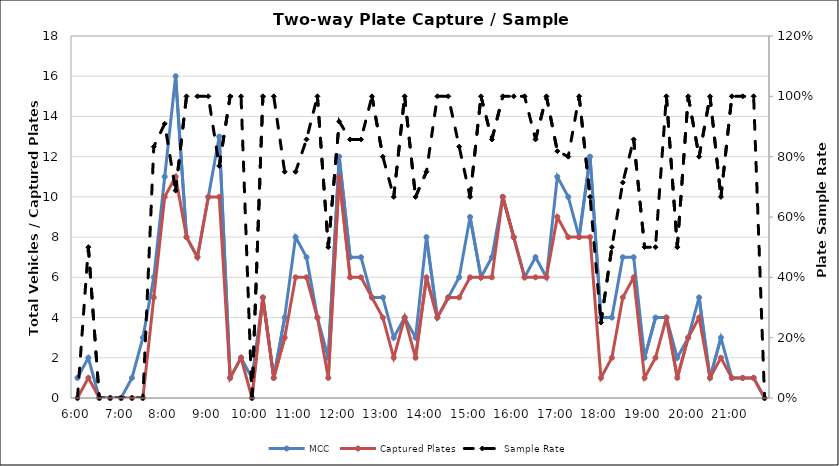
| Category | MCC | Captured Plates |
|---|---|---|
| 0.25 | 1 | 0 |
| 0.260416666666667 | 2 | 1 |
| 0.270833333333333 | 0 | 0 |
| 0.28125 | 0 | 0 |
| 0.291666666666667 | 0 | 0 |
| 0.302083333333333 | 1 | 0 |
| 0.3125 | 3 | 0 |
| 0.322916666666667 | 6 | 5 |
| 0.333333333333333 | 11 | 10 |
| 0.34375 | 16 | 11 |
| 0.354166666666667 | 8 | 8 |
| 0.364583333333333 | 7 | 7 |
| 0.375 | 10 | 10 |
| 0.385416666666667 | 13 | 10 |
| 0.395833333333333 | 1 | 1 |
| 0.40625 | 2 | 2 |
| 0.416666666666667 | 1 | 0 |
| 0.427083333333333 | 5 | 5 |
| 0.4375 | 1 | 1 |
| 0.447916666666667 | 4 | 3 |
| 0.458333333333333 | 8 | 6 |
| 0.46875 | 7 | 6 |
| 0.479166666666667 | 4 | 4 |
| 0.489583333333333 | 2 | 1 |
| 0.5 | 12 | 11 |
| 0.510416666666667 | 7 | 6 |
| 0.520833333333333 | 7 | 6 |
| 0.53125 | 5 | 5 |
| 0.541666666666667 | 5 | 4 |
| 0.552083333333333 | 3 | 2 |
| 0.5625 | 4 | 4 |
| 0.572916666666667 | 3 | 2 |
| 0.583333333333333 | 8 | 6 |
| 0.59375 | 4 | 4 |
| 0.604166666666667 | 5 | 5 |
| 0.614583333333333 | 6 | 5 |
| 0.625 | 9 | 6 |
| 0.635416666666667 | 6 | 6 |
| 0.645833333333333 | 7 | 6 |
| 0.65625 | 10 | 10 |
| 0.666666666666667 | 8 | 8 |
| 0.677083333333333 | 6 | 6 |
| 0.6875 | 7 | 6 |
| 0.697916666666667 | 6 | 6 |
| 0.708333333333333 | 11 | 9 |
| 0.71875 | 10 | 8 |
| 0.729166666666667 | 8 | 8 |
| 0.739583333333333 | 12 | 8 |
| 0.75 | 4 | 1 |
| 0.760416666666667 | 4 | 2 |
| 0.770833333333333 | 7 | 5 |
| 0.78125 | 7 | 6 |
| 0.791666666666667 | 2 | 1 |
| 0.802083333333333 | 4 | 2 |
| 0.8125 | 4 | 4 |
| 0.822916666666667 | 2 | 1 |
| 0.833333333333333 | 3 | 3 |
| 0.84375 | 5 | 4 |
| 0.854166666666667 | 1 | 1 |
| 0.864583333333333 | 3 | 2 |
| 0.875 | 1 | 1 |
| 0.885416666666667 | 1 | 1 |
| 0.895833333333333 | 1 | 1 |
| 0.90625 | 0 | 0 |